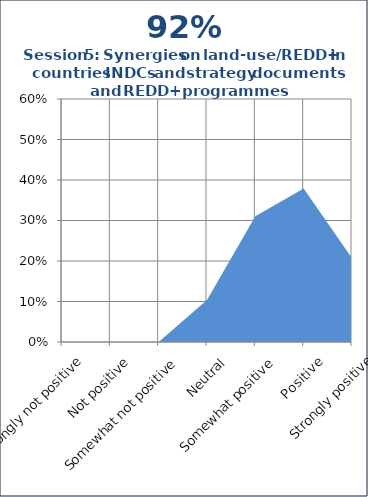
| Category | Series 1 |
|---|---|
| Strongly not positive | 0 |
| Not positive | 0 |
| Somewhat not positive | 0 |
| Neutral | 0.103 |
| Somewhat positive | 0.31 |
| Positive | 0.379 |
| Strongly positive | 0.207 |